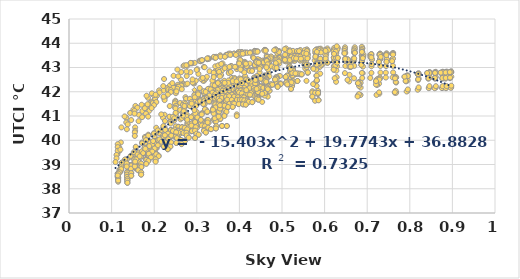
| Category | UTCI |
|---|---|
| 0.571264 | 41.801 |
| 0.678207 | 42.354 |
| 0.720713 | 42.436 |
| 0.765281 | 42.552 |
| 0.787693 | 42.621 |
| 0.819697 | 42.715 |
| 0.84077 | 42.77 |
| 0.859225 | 42.775 |
| 0.872616 | 42.787 |
| 0.884103 | 42.786 |
| 0.893847 | 42.8 |
| 0.342069 | 40.906 |
| 0.453655 | 41.915 |
| 0.521057 | 42.115 |
| 0.581872 | 42.474 |
| 0.621487 | 42.911 |
| 0.661517 | 43.022 |
| 0.686322 | 43.104 |
| 0.710557 | 43.135 |
| 0.72743 | 43.232 |
| 0.745379 | 43.233 |
| 0.758452 | 43.259 |
| 0.25131 | 40.328 |
| 0.339586 | 41.163 |
| 0.416046 | 41.752 |
| 0.469478 | 42.249 |
| 0.520092 | 42.954 |
| 0.557076 | 43.087 |
| 0.589356 | 43.181 |
| 0.622196 | 43.562 |
| 0.646584 | 43.586 |
| 0.671 | 43.605 |
| 0.687525 | 43.638 |
| 0.217103 | 39.941 |
| 0.296 | 40.753 |
| 0.356713 | 41.462 |
| 0.417143 | 41.677 |
| 0.455724 | 42.173 |
| 0.496497 | 42.326 |
| 0.531517 | 42.743 |
| 0.557729 | 43.111 |
| 0.585232 | 43.162 |
| 0.606966 | 43.194 |
| 0.630881 | 43.397 |
| 0.178851 | 39.65 |
| 0.250621 | 40.148 |
| 0.309287 | 40.839 |
| 0.354483 | 41.442 |
| 0.403418 | 41.636 |
| 0.444469 | 41.829 |
| 0.477069 | 42.291 |
| 0.510366 | 42.379 |
| 0.536267 | 42.444 |
| 0.560655 | 42.779 |
| 0.581065 | 43.118 |
| 0.169839 | 38.899 |
| 0.225379 | 39.919 |
| 0.275379 | 40.321 |
| 0.3187 | 40.58 |
| 0.365502 | 41.447 |
| 0.401159 | 41.664 |
| 0.44023 | 41.808 |
| 0.467119 | 42.223 |
| 0.496791 | 42.318 |
| 0.522172 | 42.383 |
| 0.546054 | 42.71 |
| 0.162299 | 38.765 |
| 0.204828 | 39.451 |
| 0.252851 | 40.1 |
| 0.295764 | 40.396 |
| 0.337701 | 41.278 |
| 0.376607 | 41.495 |
| 0.405977 | 41.667 |
| 0.439958 | 41.762 |
| 0.464607 | 42.188 |
| 0.489862 | 42.239 |
| 0.512368 | 42.303 |
| 0.145931 | 38.645 |
| 0.192414 | 39.325 |
| 0.239333 | 39.914 |
| 0.276296 | 40.198 |
| 0.319157 | 40.457 |
| 0.351283 | 41.036 |
| 0.385172 | 41.522 |
| 0.411438 | 41.642 |
| 0.442759 | 41.741 |
| 0.464897 | 41.837 |
| 0.489533 | 42.202 |
| 0.145931 | 38.536 |
| 0.186207 | 39.177 |
| 0.22269 | 39.746 |
| 0.26266 | 40.015 |
| 0.298927 | 40.269 |
| 0.326952 | 40.516 |
| 0.36469 | 41.062 |
| 0.387798 | 41.508 |
| 0.41851 | 41.613 |
| 0.440931 | 41.707 |
| 0.466575 | 41.798 |
| 0.13692 | 38.405 |
| 0.181379 | 39.055 |
| 0.210184 | 39.37 |
| 0.251862 | 39.889 |
| 0.280843 | 40.124 |
| 0.316745 | 40.391 |
| 0.345724 | 40.571 |
| 0.373369 | 41.369 |
| 0.398152 | 41.492 |
| 0.421862 | 41.584 |
| 0.444659 | 41.675 |
| 0.13692 | 38.334 |
| 0.169379 | 38.674 |
| 0.203103 | 39.249 |
| 0.237833 | 39.739 |
| 0.272383 | 39.994 |
| 0.304276 | 40.232 |
| 0.333103 | 40.455 |
| 0.359194 | 40.588 |
| 0.384138 | 41.375 |
| 0.408724 | 41.482 |
| 0.430038 | 41.572 |
| 0.13692 | 38.247 |
| 0.169379 | 38.587 |
| 0.203103 | 39.146 |
| 0.231842 | 39.629 |
| 0.264169 | 39.843 |
| 0.29589 | 40.092 |
| 0.321103 | 40.321 |
| 0.344806 | 40.488 |
| 0.37051 | 40.587 |
| 0.393897 | 41.068 |
| 0.41482 | 41.473 |
| 0.584708 | 41.948 |
| 0.680828 | 42.397 |
| 0.728218 | 42.508 |
| 0.766844 | 42.576 |
| 0.795344 | 42.635 |
| 0.820484 | 42.716 |
| 0.846097 | 42.768 |
| 0.861181 | 42.78 |
| 0.877339 | 42.79 |
| 0.886333 | 42.791 |
| 0.897443 | 42.802 |
| 0.352991 | 41.188 |
| 0.452621 | 41.885 |
| 0.524394 | 42.396 |
| 0.580738 | 42.662 |
| 0.629298 | 43.052 |
| 0.657814 | 43.035 |
| 0.69023 | 43.461 |
| 0.709687 | 43.497 |
| 0.730869 | 43.513 |
| 0.744648 | 43.521 |
| 0.760794 | 43.545 |
| 0.250246 | 40.34 |
| 0.33765 | 41.174 |
| 0.411896 | 42.086 |
| 0.467357 | 42.274 |
| 0.520706 | 42.68 |
| 0.554644 | 43.098 |
| 0.59035 | 43.359 |
| 0.62156 | 43.41 |
| 0.64779 | 43.597 |
| 0.668992 | 43.621 |
| 0.68849 | 43.643 |
| 0.19939 | 39.96 |
| 0.276882 | 40.841 |
| 0.341392 | 41.474 |
| 0.40431 | 42.02 |
| 0.45058 | 42.2 |
| 0.487457 | 42.35 |
| 0.524736 | 42.751 |
| 0.552955 | 43.114 |
| 0.580758 | 43.17 |
| 0.601886 | 43.367 |
| 0.62662 | 43.401 |
| 0.178513 | 39.649 |
| 0.240113 | 40.188 |
| 0.297167 | 40.866 |
| 0.351865 | 41.471 |
| 0.403219 | 41.679 |
| 0.441509 | 42.147 |
| 0.473692 | 42.301 |
| 0.510854 | 42.398 |
| 0.534852 | 42.733 |
| 0.559096 | 43.085 |
| 0.579518 | 43.136 |
| 0.153448 | 39.145 |
| 0.225862 | 39.947 |
| 0.262342 | 40.329 |
| 0.320097 | 41.274 |
| 0.362151 | 41.482 |
| 0.40046 | 41.686 |
| 0.433956 | 41.832 |
| 0.463788 | 42.239 |
| 0.493278 | 42.327 |
| 0.517514 | 42.399 |
| 0.541627 | 42.72 |
| 0.136524 | 39.038 |
| 0.186875 | 39.991 |
| 0.241851 | 40.379 |
| 0.289112 | 40.681 |
| 0.330575 | 41.594 |
| 0.369066 | 41.78 |
| 0.399578 | 41.959 |
| 0.434928 | 42.36 |
| 0.460379 | 42.46 |
| 0.4845 | 42.519 |
| 0.508006 | 42.605 |
| 0.136524 | 38.906 |
| 0.181537 | 39.582 |
| 0.222023 | 40.195 |
| 0.272585 | 40.5 |
| 0.312175 | 41.117 |
| 0.34398 | 41.335 |
| 0.376261 | 41.808 |
| 0.405178 | 41.928 |
| 0.437047 | 42.032 |
| 0.457715 | 42.427 |
| 0.483533 | 42.495 |
| 0.122414 | 38.804 |
| 0.173118 | 39.436 |
| 0.205743 | 39.756 |
| 0.25843 | 40.31 |
| 0.288644 | 40.595 |
| 0.324555 | 41.162 |
| 0.358931 | 41.361 |
| 0.387034 | 41.791 |
| 0.413133 | 41.89 |
| 0.438204 | 41.994 |
| 0.461561 | 42.091 |
| 0.11863 | 38.681 |
| 0.164884 | 39.056 |
| 0.198884 | 39.596 |
| 0.241017 | 40.187 |
| 0.279433 | 40.439 |
| 0.307713 | 40.664 |
| 0.342919 | 41.221 |
| 0.369889 | 41.661 |
| 0.394356 | 41.773 |
| 0.419702 | 41.877 |
| 0.442763 | 41.974 |
| 0.115096 | 38.605 |
| 0.156897 | 38.942 |
| 0.190258 | 39.472 |
| 0.23402 | 40.037 |
| 0.26993 | 40.297 |
| 0.300661 | 40.518 |
| 0.32798 | 40.727 |
| 0.354822 | 40.874 |
| 0.379165 | 41.66 |
| 0.406087 | 41.768 |
| 0.426007 | 41.874 |
| 0.114033 | 38.505 |
| 0.15528 | 38.845 |
| 0.18514 | 39.38 |
| 0.224289 | 39.916 |
| 0.255586 | 40.168 |
| 0.286615 | 40.366 |
| 0.31606 | 40.599 |
| 0.343236 | 40.763 |
| 0.36643 | 41.234 |
| 0.390764 | 41.659 |
| 0.410089 | 41.762 |
| 0.577969 | 41.962 |
| 0.684588 | 42.174 |
| 0.724429 | 42.522 |
| 0.768051 | 42.381 |
| 0.792728 | 42.655 |
| 0.818663 | 42.726 |
| 0.845855 | 42.787 |
| 0.858292 | 42.792 |
| 0.878673 | 42.803 |
| 0.88494 | 42.805 |
| 0.894636 | 42.815 |
| 0.34892 | 41.531 |
| 0.459676 | 41.976 |
| 0.525304 | 42.713 |
| 0.573459 | 42.971 |
| 0.627352 | 43.244 |
| 0.654075 | 43.341 |
| 0.687297 | 43.494 |
| 0.707162 | 43.517 |
| 0.728405 | 43.533 |
| 0.744036 | 43.545 |
| 0.758815 | 43.569 |
| 0.248644 | 40.141 |
| 0.349191 | 41.595 |
| 0.417071 | 41.862 |
| 0.470474 | 42.054 |
| 0.520729 | 42.767 |
| 0.557889 | 42.871 |
| 0.595675 | 43.137 |
| 0.623682 | 43.338 |
| 0.648306 | 43.366 |
| 0.668332 | 43.383 |
| 0.687488 | 43.482 |
| 0.198989 | 40.286 |
| 0.269177 | 41.111 |
| 0.346042 | 41.81 |
| 0.40532 | 42.347 |
| 0.449887 | 42.537 |
| 0.48651 | 42.97 |
| 0.524518 | 43.374 |
| 0.550387 | 43.588 |
| 0.581454 | 43.648 |
| 0.602322 | 43.69 |
| 0.628408 | 43.714 |
| 0.156838 | 39.702 |
| 0.246759 | 40.81 |
| 0.295969 | 41.56 |
| 0.351402 | 41.809 |
| 0.394745 | 42.312 |
| 0.4384 | 42.487 |
| 0.467967 | 42.631 |
| 0.505995 | 43.302 |
| 0.53421 | 43.363 |
| 0.555348 | 43.401 |
| 0.57792 | 43.613 |
| 0.152053 | 39.431 |
| 0.212315 | 40.292 |
| 0.26746 | 40.956 |
| 0.317342 | 41.61 |
| 0.359856 | 41.827 |
| 0.395531 | 42.321 |
| 0.438782 | 42.483 |
| 0.460668 | 42.572 |
| 0.49241 | 42.646 |
| 0.516151 | 43.023 |
| 0.54388 | 43.355 |
| 0.143816 | 39.301 |
| 0.194621 | 39.8 |
| 0.248033 | 40.433 |
| 0.29438 | 40.777 |
| 0.331787 | 41.662 |
| 0.372248 | 42.171 |
| 0.399298 | 42.032 |
| 0.436562 | 42.435 |
| 0.460809 | 42.532 |
| 0.485486 | 42.595 |
| 0.511245 | 42.659 |
| 0.130759 | 39.176 |
| 0.182829 | 39.903 |
| 0.235163 | 39.999 |
| 0.276043 | 40.573 |
| 0.314943 | 41.495 |
| 0.349793 | 41.713 |
| 0.378323 | 41.898 |
| 0.408424 | 42.301 |
| 0.438869 | 42.41 |
| 0.460591 | 42.505 |
| 0.487175 | 42.565 |
| 0.123997 | 39.07 |
| 0.171429 | 39.46 |
| 0.21695 | 39.838 |
| 0.256057 | 40.377 |
| 0.294013 | 40.978 |
| 0.321324 | 41.253 |
| 0.354542 | 41.745 |
| 0.381093 | 41.876 |
| 0.412474 | 42.277 |
| 0.434553 | 42.374 |
| 0.462261 | 42.482 |
| 0.115365 | 38.455 |
| 0.161084 | 39.347 |
| 0.205877 | 39.673 |
| 0.245763 | 40.279 |
| 0.279342 | 40.519 |
| 0.3104 | 41.066 |
| 0.33887 | 41.319 |
| 0.367554 | 41.749 |
| 0.395834 | 41.855 |
| 0.419792 | 41.949 |
| 0.441686 | 42.358 |
| 0.115177 | 38.386 |
| 0.153793 | 38.987 |
| 0.192818 | 39.534 |
| 0.234181 | 40.136 |
| 0.264149 | 40.368 |
| 0.297655 | 40.6 |
| 0.324043 | 40.836 |
| 0.352361 | 41.62 |
| 0.382465 | 41.757 |
| 0.403379 | 41.852 |
| 0.42681 | 42.255 |
| 0.115365 | 38.29 |
| 0.154609 | 38.889 |
| 0.192812 | 39.42 |
| 0.222227 | 39.737 |
| 0.259342 | 40.263 |
| 0.290152 | 40.46 |
| 0.311272 | 40.703 |
| 0.339544 | 40.858 |
| 0.369077 | 41.622 |
| 0.388195 | 41.753 |
| 0.412972 | 41.861 |
| 0.584777 | 42.032 |
| 0.680891 | 42.239 |
| 0.727836 | 42.333 |
| 0.766995 | 42.405 |
| 0.794881 | 42.465 |
| 0.820828 | 42.544 |
| 0.847406 | 42.596 |
| 0.860932 | 42.607 |
| 0.877241 | 42.611 |
| 0.886548 | 42.611 |
| 0.897435 | 42.623 |
| 0.351964 | 41.637 |
| 0.452622 | 42.156 |
| 0.525937 | 42.93 |
| 0.581055 | 42.973 |
| 0.628809 | 43.355 |
| 0.659062 | 43.174 |
| 0.691168 | 43.53 |
| 0.709687 | 43.555 |
| 0.730189 | 43.573 |
| 0.745735 | 43.58 |
| 0.760982 | 43.598 |
| 0.255068 | 41.201 |
| 0.336594 | 41.951 |
| 0.415992 | 42.531 |
| 0.467857 | 43.14 |
| 0.518607 | 43.265 |
| 0.556469 | 43.456 |
| 0.592297 | 43.698 |
| 0.62156 | 43.736 |
| 0.647003 | 43.758 |
| 0.669965 | 43.775 |
| 0.68867 | 43.793 |
| 0.201045 | 40.169 |
| 0.276293 | 41.068 |
| 0.344278 | 41.973 |
| 0.404884 | 42.201 |
| 0.447443 | 42.801 |
| 0.489598 | 43.25 |
| 0.525292 | 43.36 |
| 0.552955 | 43.415 |
| 0.579475 | 43.454 |
| 0.603682 | 43.548 |
| 0.627013 | 43.73 |
| 0.178879 | 39.892 |
| 0.23944 | 40.79 |
| 0.303548 | 41.749 |
| 0.350328 | 41.984 |
| 0.40055 | 42.186 |
| 0.44398 | 42.627 |
| 0.471614 | 43.043 |
| 0.510854 | 43.306 |
| 0.533647 | 43.345 |
| 0.560592 | 43.388 |
| 0.579859 | 43.424 |
| 0.153876 | 39.363 |
| 0.224455 | 40.528 |
| 0.261727 | 40.863 |
| 0.318411 | 41.811 |
| 0.356322 | 42.003 |
| 0.403218 | 42.219 |
| 0.439778 | 42.338 |
| 0.463788 | 42.998 |
| 0.492341 | 43.24 |
| 0.519231 | 43.308 |
| 0.542227 | 43.333 |
| 0.134818 | 39.19 |
| 0.186063 | 40.229 |
| 0.243531 | 40.913 |
| 0.287336 | 41.586 |
| 0.328656 | 42.127 |
| 0.371968 | 42.325 |
| 0.403199 | 42.49 |
| 0.434928 | 42.569 |
| 0.45957 | 42.649 |
| 0.486372 | 43.143 |
| 0.50881 | 43.508 |
| 0.134818 | 39.032 |
| 0.181537 | 40.065 |
| 0.225787 | 40.424 |
| 0.270751 | 41.412 |
| 0.308079 | 41.659 |
| 0.347098 | 41.874 |
| 0.37973 | 42.346 |
| 0.405178 | 42.457 |
| 0.435555 | 42.547 |
| 0.45974 | 42.625 |
| 0.483913 | 42.958 |
| 0.122866 | 38.918 |
| 0.171569 | 39.907 |
| 0.208846 | 40 |
| 0.256507 | 40.56 |
| 0.290614 | 41.504 |
| 0.327787 | 41.73 |
| 0.356511 | 42.216 |
| 0.387034 | 42.345 |
| 0.411658 | 42.435 |
| 0.440288 | 42.528 |
| 0.460766 | 42.607 |
| 0.1191 | 38.795 |
| 0.163336 | 39.487 |
| 0.199902 | 39.856 |
| 0.238998 | 40.426 |
| 0.278053 | 40.708 |
| 0.312011 | 41.606 |
| 0.339263 | 41.782 |
| 0.369889 | 42.223 |
| 0.392734 | 42.328 |
| 0.422719 | 42.424 |
| 0.441962 | 42.514 |
| 0.121212 | 38.722 |
| 0.15528 | 39.35 |
| 0.194864 | 39.722 |
| 0.231958 | 40.289 |
| 0.265401 | 40.548 |
| 0.299648 | 41.168 |
| 0.327494 | 41.666 |
| 0.354822 | 42.11 |
| 0.376863 | 42.228 |
| 0.407435 | 42.331 |
| 0.426398 | 42.419 |
| 0.114502 | 38.63 |
| 0.15528 | 39.233 |
| 0.186305 | 39.361 |
| 0.220208 | 40.18 |
| 0.257021 | 40.409 |
| 0.291178 | 41.017 |
| 0.313602 | 41.543 |
| 0.343236 | 41.704 |
| 0.364352 | 42.108 |
| 0.393085 | 42.226 |
| 0.410813 | 42.325 |
| 0.571288 | 42.021 |
| 0.678395 | 41.854 |
| 0.723167 | 42.279 |
| 0.764874 | 41.96 |
| 0.791358 | 42.429 |
| 0.819569 | 42.481 |
| 0.843544 | 42.537 |
| 0.859195 | 42.539 |
| 0.876526 | 42.54 |
| 0.884034 | 42.541 |
| 0.894307 | 42.558 |
| 0.342146 | 42.246 |
| 0.454046 | 42.128 |
| 0.522164 | 42.243 |
| 0.58106 | 43.008 |
| 0.626093 | 43.16 |
| 0.661264 | 43.231 |
| 0.687579 | 43.306 |
| 0.710908 | 43.325 |
| 0.730556 | 43.341 |
| 0.745241 | 43.337 |
| 0.759829 | 43.357 |
| 0.250856 | 41.037 |
| 0.338793 | 42.44 |
| 0.412955 | 43.132 |
| 0.468382 | 43.302 |
| 0.519562 | 43.411 |
| 0.556609 | 43.541 |
| 0.5908 | 43.776 |
| 0.622671 | 43.81 |
| 0.647963 | 43.834 |
| 0.670744 | 43.835 |
| 0.687492 | 43.855 |
| 0.216608 | 40.417 |
| 0.295115 | 41.894 |
| 0.349128 | 42.3 |
| 0.416502 | 43.118 |
| 0.455172 | 43.288 |
| 0.49592 | 43.435 |
| 0.531109 | 43.548 |
| 0.558339 | 43.747 |
| 0.58694 | 43.772 |
| 0.606627 | 43.786 |
| 0.63096 | 43.808 |
| 0.178231 | 40.137 |
| 0.249784 | 41.63 |
| 0.302772 | 41.946 |
| 0.353051 | 42.315 |
| 0.402255 | 43.13 |
| 0.443851 | 43.31 |
| 0.475169 | 43.438 |
| 0.511092 | 43.506 |
| 0.537208 | 43.537 |
| 0.560291 | 43.563 |
| 0.581257 | 43.753 |
| 0.169828 | 39.323 |
| 0.224425 | 41.051 |
| 0.273345 | 41.777 |
| 0.317221 | 42.005 |
| 0.364341 | 42.357 |
| 0.400546 | 43.212 |
| 0.439693 | 43.318 |
| 0.467894 | 43.402 |
| 0.491967 | 43.463 |
| 0.521857 | 43.501 |
| 0.544555 | 43.519 |
| 0.162261 | 39.143 |
| 0.203879 | 40.299 |
| 0.249383 | 41.591 |
| 0.29426 | 41.86 |
| 0.338582 | 42.116 |
| 0.375948 | 42.807 |
| 0.404755 | 43.251 |
| 0.440805 | 43.296 |
| 0.463999 | 43.373 |
| 0.489529 | 43.404 |
| 0.5131 | 43.45 |
| 0.145881 | 38.979 |
| 0.191451 | 39.822 |
| 0.236511 | 41.41 |
| 0.274756 | 41.71 |
| 0.316686 | 41.948 |
| 0.350575 | 42.399 |
| 0.382567 | 42.57 |
| 0.412375 | 43.231 |
| 0.438122 | 43.286 |
| 0.464529 | 43.342 |
| 0.487906 | 43.378 |
| 0.145881 | 38.855 |
| 0.185201 | 39.364 |
| 0.220609 | 40.929 |
| 0.261044 | 41.538 |
| 0.302263 | 41.84 |
| 0.326121 | 42.114 |
| 0.364356 | 42.453 |
| 0.388751 | 42.567 |
| 0.414235 | 43.206 |
| 0.440535 | 43.263 |
| 0.461799 | 43.319 |
| 0.136877 | 38.704 |
| 0.180388 | 39.212 |
| 0.20896 | 39.894 |
| 0.250186 | 41.426 |
| 0.284028 | 41.711 |
| 0.31592 | 42.02 |
| 0.345366 | 42.2 |
| 0.374612 | 42.467 |
| 0.400215 | 42.55 |
| 0.421462 | 42.896 |
| 0.444591 | 43.247 |
| 0.136877 | 38.613 |
| 0.168319 | 39.059 |
| 0.201057 | 39.451 |
| 0.236111 | 40.962 |
| 0.270436 | 41.551 |
| 0.303448 | 41.895 |
| 0.332759 | 42.104 |
| 0.360212 | 42.377 |
| 0.38691 | 42.477 |
| 0.408351 | 42.551 |
| 0.428582 | 42.901 |
| 0.136877 | 38.501 |
| 0.168319 | 38.943 |
| 0.199648 | 39.346 |
| 0.231117 | 40.203 |
| 0.267028 | 41.454 |
| 0.295086 | 41.771 |
| 0.320714 | 41.994 |
| 0.346159 | 42.298 |
| 0.374094 | 42.366 |
| 0.393517 | 42.46 |
| 0.41607 | 42.546 |
| 0.585645 | 41.661 |
| 0.680718 | 41.851 |
| 0.728405 | 41.919 |
| 0.767152 | 41.981 |
| 0.794796 | 42.038 |
| 0.820484 | 42.123 |
| 0.845881 | 42.17 |
| 0.86085 | 42.17 |
| 0.877044 | 42.17 |
| 0.886117 | 42.173 |
| 0.897087 | 42.185 |
| 0.351912 | 41.864 |
| 0.452252 | 42.043 |
| 0.525958 | 42.437 |
| 0.581386 | 42.237 |
| 0.628368 | 42.602 |
| 0.657814 | 42.426 |
| 0.68938 | 42.763 |
| 0.709848 | 42.778 |
| 0.731128 | 42.791 |
| 0.743678 | 42.786 |
| 0.760895 | 42.797 |
| 0.250862 | 41.941 |
| 0.337141 | 42.294 |
| 0.413526 | 42.639 |
| 0.468379 | 42.763 |
| 0.518692 | 42.863 |
| 0.554644 | 42.962 |
| 0.589068 | 43.027 |
| 0.621751 | 43.058 |
| 0.648726 | 43.065 |
| 0.669531 | 43.068 |
| 0.688411 | 43.076 |
| 0.200048 | 41.635 |
| 0.276276 | 42.647 |
| 0.34442 | 42.868 |
| 0.40376 | 43.021 |
| 0.448003 | 43.156 |
| 0.487457 | 43.435 |
| 0.523659 | 43.519 |
| 0.553169 | 43.554 |
| 0.581281 | 43.565 |
| 0.600216 | 43.571 |
| 0.627421 | 43.592 |
| 0.179167 | 41.404 |
| 0.239448 | 42.189 |
| 0.303736 | 42.736 |
| 0.348727 | 42.906 |
| 0.399642 | 43.05 |
| 0.441509 | 43.184 |
| 0.472438 | 43.29 |
| 0.511146 | 43.506 |
| 0.535773 | 43.514 |
| 0.559914 | 43.533 |
| 0.580365 | 43.55 |
| 0.152897 | 41.13 |
| 0.225144 | 41.757 |
| 0.263561 | 42.812 |
| 0.316654 | 43.021 |
| 0.360362 | 43.17 |
| 0.40046 | 43.336 |
| 0.431873 | 43.427 |
| 0.464168 | 43.484 |
| 0.492947 | 43.679 |
| 0.518508 | 43.711 |
| 0.542776 | 43.721 |
| 0.134459 | 40.931 |
| 0.185327 | 41.751 |
| 0.245488 | 42.658 |
| 0.285484 | 43.175 |
| 0.328849 | 43.364 |
| 0.369066 | 43.52 |
| 0.398036 | 43.639 |
| 0.435386 | 43.688 |
| 0.459908 | 43.728 |
| 0.48556 | 43.745 |
| 0.509406 | 43.789 |
| 0.134459 | 40.735 |
| 0.181537 | 41.346 |
| 0.223191 | 42.524 |
| 0.26884 | 43.068 |
| 0.308843 | 43.257 |
| 0.34398 | 43.434 |
| 0.374665 | 43.569 |
| 0.4057 | 43.639 |
| 0.436901 | 43.676 |
| 0.458845 | 43.72 |
| 0.484588 | 43.743 |
| 0.121792 | 39.908 |
| 0.172342 | 41.205 |
| 0.206557 | 41.836 |
| 0.254502 | 42.915 |
| 0.288921 | 43.172 |
| 0.324555 | 43.343 |
| 0.355544 | 43.489 |
| 0.387561 | 43.576 |
| 0.412432 | 43.62 |
| 0.439395 | 43.669 |
| 0.461945 | 43.715 |
| 0.117992 | 39.702 |
| 0.16408 | 41.049 |
| 0.20203 | 41.703 |
| 0.236893 | 42.262 |
| 0.277689 | 43.072 |
| 0.306324 | 43.279 |
| 0.340589 | 43.425 |
| 0.369054 | 43.519 |
| 0.395853 | 43.571 |
| 0.417026 | 43.621 |
| 0.442757 | 43.669 |
| 0.117804 | 39.558 |
| 0.15528 | 40.532 |
| 0.193966 | 41.588 |
| 0.229808 | 42.149 |
| 0.265347 | 42.38 |
| 0.295026 | 43.19 |
| 0.325036 | 43.362 |
| 0.355438 | 43.454 |
| 0.379498 | 43.535 |
| 0.401527 | 43.578 |
| 0.425782 | 43.628 |
| 0.113394 | 39.41 |
| 0.15528 | 40.388 |
| 0.188481 | 41.216 |
| 0.222188 | 42.051 |
| 0.25548 | 42.287 |
| 0.285165 | 42.809 |
| 0.312931 | 43.288 |
| 0.342396 | 43.403 |
| 0.366681 | 43.449 |
| 0.39208 | 43.535 |
| 0.411634 | 43.585 |
| 0.577563 | 41.628 |
| 0.684414 | 41.867 |
| 0.721931 | 41.869 |
| 0.767882 | 41.959 |
| 0.792613 | 42.01 |
| 0.818538 | 42.083 |
| 0.84446 | 42.15 |
| 0.858292 | 42.146 |
| 0.875568 | 42.151 |
| 0.884862 | 42.147 |
| 0.896307 | 42.163 |
| 0.348782 | 41.783 |
| 0.45931 | 41.841 |
| 0.52377 | 42.234 |
| 0.573123 | 42.317 |
| 0.626912 | 42.41 |
| 0.653738 | 42.489 |
| 0.688368 | 42.568 |
| 0.707162 | 42.569 |
| 0.729618 | 42.594 |
| 0.743724 | 42.587 |
| 0.759693 | 42.592 |
| 0.248414 | 41.525 |
| 0.34869 | 41.684 |
| 0.414897 | 42.288 |
| 0.47003 | 42.215 |
| 0.520184 | 42.599 |
| 0.557407 | 42.449 |
| 0.589609 | 42.746 |
| 0.623682 | 42.557 |
| 0.647669 | 42.769 |
| 0.669138 | 42.555 |
| 0.68751 | 42.778 |
| 0.198759 | 41.859 |
| 0.268552 | 42.305 |
| 0.345103 | 42.742 |
| 0.40532 | 42.899 |
| 0.449226 | 43.009 |
| 0.48651 | 43.178 |
| 0.52692 | 43.282 |
| 0.550387 | 43.29 |
| 0.580818 | 43.296 |
| 0.601793 | 43.304 |
| 0.628766 | 43.325 |
| 0.155908 | 41.417 |
| 0.246759 | 42.185 |
| 0.293356 | 42.336 |
| 0.350778 | 42.816 |
| 0.394023 | 42.933 |
| 0.4384 | 43.037 |
| 0.468782 | 43.151 |
| 0.505995 | 43.274 |
| 0.530262 | 43.276 |
| 0.556517 | 43.278 |
| 0.576766 | 43.291 |
| 0.151126 | 41.26 |
| 0.211586 | 42.057 |
| 0.266345 | 42.259 |
| 0.31665 | 42.448 |
| 0.35905 | 42.879 |
| 0.395531 | 43.016 |
| 0.43531 | 43.109 |
| 0.460668 | 43.139 |
| 0.493444 | 43.161 |
| 0.517414 | 43.197 |
| 0.542958 | 43.281 |
| 0.143586 | 41.126 |
| 0.194621 | 41.934 |
| 0.246299 | 42.148 |
| 0.293635 | 42.386 |
| 0.329946 | 42.845 |
| 0.372248 | 42.985 |
| 0.401207 | 43.09 |
| 0.436562 | 43.098 |
| 0.459467 | 43.128 |
| 0.486828 | 43.146 |
| 0.509341 | 43.25 |
| 0.130529 | 40.982 |
| 0.182069 | 41.835 |
| 0.232874 | 42.062 |
| 0.275271 | 42.306 |
| 0.314023 | 42.462 |
| 0.349793 | 42.934 |
| 0.380575 | 43.063 |
| 0.408424 | 43.084 |
| 0.43932 | 43.101 |
| 0.462 | 43.134 |
| 0.485962 | 43.224 |
| 0.122989 | 40.531 |
| 0.170621 | 41.464 |
| 0.212552 | 41.969 |
| 0.255251 | 42.21 |
| 0.290912 | 42.393 |
| 0.321324 | 42.544 |
| 0.35723 | 42.69 |
| 0.381093 | 43.046 |
| 0.413416 | 43.073 |
| 0.436069 | 43.106 |
| 0.462092 | 43.221 |
| 0.114345 | 39.839 |
| 0.160276 | 41.34 |
| 0.203264 | 41.875 |
| 0.244926 | 42.169 |
| 0.278222 | 42.335 |
| 0.3104 | 42.522 |
| 0.340046 | 42.652 |
| 0.367554 | 43.021 |
| 0.393747 | 43.035 |
| 0.418897 | 43.078 |
| 0.441517 | 43.19 |
| 0.114345 | 39.718 |
| 0.153793 | 41.21 |
| 0.190207 | 41.527 |
| 0.23334 | 42.094 |
| 0.263142 | 42.256 |
| 0.297655 | 42.453 |
| 0.32369 | 42.618 |
| 0.352361 | 42.82 |
| 0.376552 | 43.027 |
| 0.403379 | 43.054 |
| 0.424245 | 43.164 |
| 0.114345 | 39.565 |
| 0.153793 | 41.1 |
| 0.190207 | 41.469 |
| 0.222227 | 41.756 |
| 0.257441 | 42.207 |
| 0.290152 | 42.382 |
| 0.313805 | 42.571 |
| 0.339544 | 42.784 |
| 0.365453 | 42.973 |
| 0.389793 | 43.029 |
| 0.411073 | 43.139 |
| 0.585805 | 41.646 |
| 0.680603 | 41.902 |
| 0.728003 | 41.975 |
| 0.766844 | 42.038 |
| 0.795315 | 42.096 |
| 0.820718 | 42.18 |
| 0.846077 | 42.231 |
| 0.861181 | 42.23 |
| 0.876929 | 42.23 |
| 0.88626 | 42.235 |
| 0.897406 | 42.249 |
| 0.349195 | 42.079 |
| 0.451868 | 42.24 |
| 0.525374 | 42.636 |
| 0.580738 | 42.44 |
| 0.627621 | 42.87 |
| 0.658621 | 42.696 |
| 0.689955 | 43.039 |
| 0.71002 | 43.051 |
| 0.730814 | 43.064 |
| 0.744326 | 43.06 |
| 0.760417 | 43.069 |
| 0.254425 | 42.124 |
| 0.336594 | 42.461 |
| 0.411436 | 42.8 |
| 0.467357 | 42.921 |
| 0.518252 | 43.022 |
| 0.555833 | 43.116 |
| 0.589955 | 43.185 |
| 0.622011 | 43.284 |
| 0.648285 | 43.29 |
| 0.669406 | 43.292 |
| 0.688011 | 43.298 |
| 0.196609 | 41.534 |
| 0.275686 | 42.836 |
| 0.343369 | 43.047 |
| 0.40431 | 43.185 |
| 0.4472 | 43.314 |
| 0.488867 | 43.595 |
| 0.525741 | 43.686 |
| 0.553521 | 43.716 |
| 0.580736 | 43.724 |
| 0.601337 | 43.729 |
| 0.625431 | 43.75 |
| 0.177931 | 41.32 |
| 0.238776 | 42.068 |
| 0.3011 | 42.931 |
| 0.350328 | 43.089 |
| 0.39969 | 43.222 |
| 0.44311 | 43.345 |
| 0.474048 | 43.454 |
| 0.511514 | 43.673 |
| 0.535182 | 43.679 |
| 0.559743 | 43.697 |
| 0.578049 | 43.71 |
| 0.146038 | 40.834 |
| 0.224455 | 41.656 |
| 0.262786 | 42.501 |
| 0.318411 | 43.011 |
| 0.357414 | 43.148 |
| 0.402252 | 43.303 |
| 0.433233 | 43.389 |
| 0.464516 | 43.437 |
| 0.492883 | 43.639 |
| 0.518202 | 43.668 |
| 0.539958 | 43.676 |
| 0.137816 | 40.655 |
| 0.184483 | 41.485 |
| 0.242566 | 42.356 |
| 0.287336 | 43.185 |
| 0.326937 | 43.374 |
| 0.370964 | 43.516 |
| 0.401653 | 43.632 |
| 0.435739 | 43.663 |
| 0.459834 | 43.702 |
| 0.485273 | 43.716 |
| 0.506186 | 43.756 |
| 0.135805 | 40.454 |
| 0.180788 | 41.099 |
| 0.221241 | 42.233 |
| 0.270751 | 43.086 |
| 0.307834 | 43.267 |
| 0.34601 | 43.442 |
| 0.378316 | 43.574 |
| 0.406074 | 43.622 |
| 0.436828 | 43.657 |
| 0.458567 | 43.695 |
| 0.481609 | 43.714 |
| 0.120629 | 39.612 |
| 0.171569 | 40.953 |
| 0.204915 | 41.575 |
| 0.256507 | 42.636 |
| 0.285541 | 43.189 |
| 0.326671 | 43.355 |
| 0.354998 | 43.5 |
| 0.387928 | 43.567 |
| 0.412359 | 43.606 |
| 0.439054 | 43.65 |
| 0.461641 | 43.693 |
| 0.111555 | 39.395 |
| 0.163336 | 40.788 |
| 0.199555 | 41.447 |
| 0.238998 | 41.988 |
| 0.275362 | 43.095 |
| 0.310852 | 43.294 |
| 0.340005 | 43.439 |
| 0.370822 | 43.516 |
| 0.395025 | 43.561 |
| 0.418825 | 43.602 |
| 0.4425 | 43.65 |
| 0.111555 | 39.253 |
| 0.154504 | 40.325 |
| 0.193845 | 41.328 |
| 0.231958 | 41.882 |
| 0.264727 | 42.107 |
| 0.299648 | 42.901 |
| 0.324413 | 43.375 |
| 0.355795 | 43.448 |
| 0.378667 | 43.521 |
| 0.404292 | 43.564 |
| 0.424777 | 43.61 |
| 0.109135 | 39.101 |
| 0.154504 | 40.178 |
| 0.185811 | 40.974 |
| 0.222188 | 41.796 |
| 0.252207 | 42.016 |
| 0.289909 | 42.509 |
| 0.312344 | 43.304 |
| 0.344254 | 43.4 |
| 0.365811 | 43.443 |
| 0.391721 | 43.519 |
| 0.407822 | 43.568 |
| 0.571194 | 41.967 |
| 0.67741 | 41.805 |
| 0.720572 | 42.3 |
| 0.764874 | 41.981 |
| 0.790096 | 42.447 |
| 0.819697 | 42.511 |
| 0.84383 | 42.561 |
| 0.859195 | 42.564 |
| 0.876422 | 42.564 |
| 0.884267 | 42.569 |
| 0.894472 | 42.584 |
| 0.342207 | 42.259 |
| 0.452428 | 42.069 |
| 0.520751 | 42.732 |
| 0.58106 | 42.945 |
| 0.625151 | 43.089 |
| 0.661517 | 43.179 |
| 0.687811 | 43.239 |
| 0.711016 | 43.335 |
| 0.729815 | 43.35 |
| 0.746121 | 43.347 |
| 0.760381 | 43.366 |
| 0.250856 | 41.421 |
| 0.339586 | 42.605 |
| 0.41491 | 43.095 |
| 0.468382 | 43.224 |
| 0.521101 | 43.325 |
| 0.557076 | 43.468 |
| 0.59131 | 43.702 |
| 0.622736 | 43.736 |
| 0.647336 | 43.76 |
| 0.670744 | 43.757 |
| 0.688255 | 43.776 |
| 0.216608 | 41.068 |
| 0.294441 | 42.078 |
| 0.354221 | 42.632 |
| 0.417143 | 43.058 |
| 0.457035 | 43.216 |
| 0.495201 | 43.369 |
| 0.529975 | 43.469 |
| 0.558426 | 43.676 |
| 0.585647 | 43.7 |
| 0.608136 | 43.714 |
| 0.629965 | 43.74 |
| 0.179034 | 40.102 |
| 0.24898 | 41.345 |
| 0.306909 | 42.153 |
| 0.353051 | 42.327 |
| 0.403104 | 43.07 |
| 0.442984 | 43.257 |
| 0.47329 | 43.376 |
| 0.5112 | 43.433 |
| 0.536072 | 43.459 |
| 0.560291 | 43.489 |
| 0.580178 | 43.514 |
| 0.169224 | 39.333 |
| 0.225379 | 40.793 |
| 0.273514 | 41.508 |
| 0.317221 | 41.724 |
| 0.365316 | 42.367 |
| 0.399521 | 43.166 |
| 0.440217 | 43.269 |
| 0.46811 | 43.339 |
| 0.493568 | 43.395 |
| 0.521857 | 43.431 |
| 0.543308 | 43.448 |
| 0.162483 | 39.128 |
| 0.204828 | 40.515 |
| 0.250229 | 41.308 |
| 0.29426 | 41.587 |
| 0.339387 | 41.954 |
| 0.374891 | 42.772 |
| 0.402534 | 42.918 |
| 0.441 | 43.244 |
| 0.463307 | 43.313 |
| 0.489529 | 43.343 |
| 0.51141 | 43.379 |
| 0.146115 | 38.958 |
| 0.1905 | 39.899 |
| 0.23798 | 40.752 |
| 0.274756 | 41.43 |
| 0.315278 | 41.672 |
| 0.349444 | 42.361 |
| 0.379789 | 42.815 |
| 0.412548 | 43.18 |
| 0.439373 | 43.234 |
| 0.464529 | 43.289 |
| 0.486285 | 43.321 |
| 0.145203 | 38.827 |
| 0.186207 | 39.364 |
| 0.221418 | 40.583 |
| 0.261044 | 41.25 |
| 0.301896 | 41.532 |
| 0.324954 | 41.777 |
| 0.363334 | 42.102 |
| 0.388989 | 42.516 |
| 0.41527 | 43.156 |
| 0.440535 | 43.215 |
| 0.464093 | 43.266 |
| 0.136195 | 38.669 |
| 0.181379 | 39.187 |
| 0.208355 | 40.407 |
| 0.250186 | 41.127 |
| 0.283911 | 41.408 |
| 0.31592 | 41.692 |
| 0.347974 | 41.859 |
| 0.374612 | 42.118 |
| 0.398061 | 42.502 |
| 0.423886 | 42.86 |
| 0.445022 | 43.198 |
| 0.136195 | 38.588 |
| 0.169379 | 39.04 |
| 0.2017 | 39.973 |
| 0.236111 | 40.972 |
| 0.270711 | 41.264 |
| 0.30221 | 41.561 |
| 0.328399 | 41.777 |
| 0.360515 | 42.037 |
| 0.384368 | 42.439 |
| 0.409208 | 42.504 |
| 0.429938 | 42.857 |
| 0.136195 | 38.493 |
| 0.167277 | 38.919 |
| 0.200396 | 39.855 |
| 0.23012 | 40.196 |
| 0.267045 | 41.135 |
| 0.295086 | 41.433 |
| 0.321794 | 41.664 |
| 0.346159 | 41.964 |
| 0.372054 | 42.028 |
| 0.393517 | 42.425 |
| 0.414231 | 42.5 |
| 0.584531 | 41.902 |
| 0.680778 | 42.394 |
| 0.729877 | 42.545 |
| 0.766502 | 42.618 |
| 0.79496 | 42.678 |
| 0.820605 | 42.767 |
| 0.846928 | 42.811 |
| 0.86111 | 42.822 |
| 0.877104 | 42.825 |
| 0.886409 | 42.831 |
| 0.896955 | 42.844 |
| 0.352262 | 41.631 |
| 0.452311 | 42.196 |
| 0.525497 | 42.899 |
| 0.579926 | 42.908 |
| 0.627722 | 43.275 |
| 0.658297 | 43.12 |
| 0.690614 | 43.45 |
| 0.709505 | 43.546 |
| 0.730162 | 43.564 |
| 0.745103 | 43.572 |
| 0.760258 | 43.587 |
| 0.250917 | 40.574 |
| 0.33661 | 41.965 |
| 0.416115 | 42.501 |
| 0.466133 | 43.131 |
| 0.51846 | 43.261 |
| 0.555341 | 43.377 |
| 0.591367 | 43.62 |
| 0.621286 | 43.66 |
| 0.646957 | 43.681 |
| 0.669406 | 43.699 |
| 0.687413 | 43.715 |
| 0.200147 | 39.951 |
| 0.275715 | 40.976 |
| 0.343267 | 41.662 |
| 0.40376 | 42.191 |
| 0.447408 | 42.942 |
| 0.486854 | 43.25 |
| 0.52685 | 43.349 |
| 0.552586 | 43.403 |
| 0.579427 | 43.438 |
| 0.602586 | 43.462 |
| 0.626054 | 43.658 |
| 0.179359 | 39.656 |
| 0.238811 | 40.69 |
| 0.298792 | 41.427 |
| 0.350513 | 41.676 |
| 0.399866 | 42.183 |
| 0.440816 | 42.647 |
| 0.475546 | 43.05 |
| 0.510466 | 43.303 |
| 0.533653 | 43.338 |
| 0.559743 | 43.379 |
| 0.578833 | 43.41 |
| 0.15373 | 39.353 |
| 0.224431 | 40.438 |
| 0.264721 | 40.916 |
| 0.318596 | 41.497 |
| 0.357919 | 41.703 |
| 0.399719 | 42.223 |
| 0.43719 | 42.342 |
| 0.463417 | 43.008 |
| 0.492299 | 43.243 |
| 0.518202 | 43.307 |
| 0.540855 | 43.332 |
| 0.135339 | 39.209 |
| 0.186094 | 40.192 |
| 0.244133 | 40.97 |
| 0.2875 | 41.578 |
| 0.329773 | 41.842 |
| 0.368276 | 42.048 |
| 0.403187 | 42.514 |
| 0.434549 | 42.591 |
| 0.459215 | 42.673 |
| 0.485273 | 43.179 |
| 0.507186 | 43.53 |
| 0.135339 | 39.058 |
| 0.180788 | 40.009 |
| 0.226155 | 40.426 |
| 0.270915 | 41.411 |
| 0.308191 | 41.651 |
| 0.343125 | 41.903 |
| 0.38004 | 42.071 |
| 0.404775 | 42.177 |
| 0.436226 | 42.567 |
| 0.458567 | 42.652 |
| 0.482665 | 42.998 |
| 0.122719 | 38.926 |
| 0.171607 | 39.876 |
| 0.209219 | 40.009 |
| 0.256671 | 40.544 |
| 0.287755 | 41.511 |
| 0.323645 | 41.737 |
| 0.358744 | 41.945 |
| 0.386638 | 42.072 |
| 0.411715 | 42.155 |
| 0.439054 | 42.556 |
| 0.460449 | 42.636 |
| 0.118953 | 38.789 |
| 0.16339 | 39.494 |
| 0.201718 | 39.846 |
| 0.239204 | 40.422 |
| 0.278512 | 40.703 |
| 0.307713 | 41.609 |
| 0.341077 | 41.795 |
| 0.369474 | 41.959 |
| 0.392871 | 42.057 |
| 0.420965 | 42.46 |
| 0.441619 | 42.543 |
| 0.118056 | 38.702 |
| 0.155424 | 39.362 |
| 0.196176 | 39.708 |
| 0.232122 | 40.273 |
| 0.265058 | 40.534 |
| 0.296439 | 41.109 |
| 0.325363 | 41.675 |
| 0.354432 | 41.836 |
| 0.377041 | 41.967 |
| 0.403748 | 42.064 |
| 0.423908 | 42.151 |
| 0.114356 | 38.622 |
| 0.154504 | 39.251 |
| 0.187647 | 39.371 |
| 0.222393 | 40.149 |
| 0.25463 | 40.406 |
| 0.286615 | 40.951 |
| 0.315477 | 41.56 |
| 0.342838 | 41.723 |
| 0.364479 | 41.833 |
| 0.391721 | 41.969 |
| 0.409102 | 42.063 |
| 0.577762 | 41.959 |
| 0.684588 | 42.368 |
| 0.722167 | 42.498 |
| 0.768051 | 42.595 |
| 0.792728 | 42.658 |
| 0.818663 | 42.73 |
| 0.845007 | 42.791 |
| 0.858388 | 42.796 |
| 0.877114 | 42.807 |
| 0.88494 | 42.809 |
| 0.895313 | 42.818 |
| 0.349331 | 41.208 |
| 0.459747 | 41.946 |
| 0.524373 | 42.674 |
| 0.57362 | 42.946 |
| 0.627367 | 43.23 |
| 0.654215 | 43.33 |
| 0.688557 | 43.411 |
| 0.707617 | 43.434 |
| 0.729493 | 43.522 |
| 0.744159 | 43.534 |
| 0.759644 | 43.556 |
| 0.249167 | 40.132 |
| 0.349191 | 41.281 |
| 0.415623 | 41.525 |
| 0.470715 | 42.039 |
| 0.520838 | 42.761 |
| 0.55803 | 43.017 |
| 0.592328 | 43.113 |
| 0.62423 | 43.325 |
| 0.648469 | 43.355 |
| 0.669581 | 43.373 |
| 0.688081 | 43.399 |
| 0.199625 | 40.278 |
| 0.269177 | 41.196 |
| 0.345977 | 41.781 |
| 0.406133 | 42.354 |
| 0.44998 | 42.537 |
| 0.487291 | 42.984 |
| 0.527634 | 43.388 |
| 0.551085 | 43.589 |
| 0.581834 | 43.643 |
| 0.602357 | 43.685 |
| 0.628605 | 43.875 |
| 0.156838 | 39.731 |
| 0.247431 | 40.902 |
| 0.29437 | 41.247 |
| 0.351724 | 41.81 |
| 0.394964 | 42.018 |
| 0.439324 | 42.492 |
| 0.470505 | 42.634 |
| 0.506826 | 43.316 |
| 0.533115 | 43.375 |
| 0.557231 | 43.57 |
| 0.578418 | 43.452 |
| 0.152053 | 39.509 |
| 0.212315 | 40.037 |
| 0.267417 | 41.015 |
| 0.317744 | 41.613 |
| 0.360059 | 41.83 |
| 0.396566 | 42.034 |
| 0.437466 | 42.487 |
| 0.461658 | 42.574 |
| 0.49503 | 42.653 |
| 0.518209 | 43.04 |
| 0.544496 | 43.366 |
| 0.144546 | 39.353 |
| 0.195355 | 39.824 |
| 0.247431 | 40.44 |
| 0.294782 | 40.779 |
| 0.331113 | 41.667 |
| 0.373371 | 41.874 |
| 0.403377 | 42.05 |
| 0.437601 | 42.137 |
| 0.463562 | 42.53 |
| 0.487685 | 42.605 |
| 0.511988 | 42.668 |
| 0.131504 | 39.209 |
| 0.182829 | 39.683 |
| 0.234014 | 40.008 |
| 0.276485 | 40.58 |
| 0.315224 | 41.496 |
| 0.350964 | 41.711 |
| 0.382126 | 41.896 |
| 0.409517 | 42.014 |
| 0.441418 | 42.115 |
| 0.462896 | 42.514 |
| 0.487696 | 42.565 |
| 0.123997 | 39.078 |
| 0.171358 | 39.547 |
| 0.213699 | 39.855 |
| 0.256499 | 40.385 |
| 0.292142 | 40.678 |
| 0.322562 | 41.185 |
| 0.35855 | 41.743 |
| 0.382277 | 41.88 |
| 0.415999 | 41.986 |
| 0.437051 | 42.089 |
| 0.46335 | 42.182 |
| 0.115365 | 38.455 |
| 0.161084 | 39.413 |
| 0.20441 | 39.704 |
| 0.246245 | 40.264 |
| 0.279475 | 40.53 |
| 0.311668 | 41.066 |
| 0.341414 | 41.322 |
| 0.368787 | 41.75 |
| 0.395858 | 41.858 |
| 0.419898 | 41.978 |
| 0.443088 | 42.07 |
| 0.115365 | 38.411 |
| 0.154609 | 39.034 |
| 0.191414 | 39.589 |
| 0.234624 | 40.123 |
| 0.264493 | 40.371 |
| 0.298973 | 40.61 |
| 0.326286 | 40.839 |
| 0.353673 | 41.631 |
| 0.381025 | 41.753 |
| 0.404451 | 41.864 |
| 0.427786 | 41.963 |
| 0.115365 | 38.34 |
| 0.154609 | 38.922 |
| 0.191414 | 39.506 |
| 0.223565 | 39.756 |
| 0.258769 | 40.248 |
| 0.291513 | 40.462 |
| 0.315294 | 40.696 |
| 0.340876 | 40.86 |
| 0.368619 | 41.62 |
| 0.390887 | 41.757 |
| 0.41373 | 41.867 |
| 0.584674 | 41.952 |
| 0.681259 | 42.327 |
| 0.728315 | 42.497 |
| 0.767152 | 42.579 |
| 0.795195 | 42.644 |
| 0.820836 | 42.718 |
| 0.846342 | 42.775 |
| 0.861273 | 42.783 |
| 0.877869 | 42.796 |
| 0.886409 | 42.799 |
| 0.897038 | 42.81 |
| 0.352251 | 41.177 |
| 0.453486 | 41.581 |
| 0.525448 | 42.363 |
| 0.581386 | 42.66 |
| 0.629486 | 43.201 |
| 0.659046 | 43.039 |
| 0.689801 | 43.384 |
| 0.709848 | 43.414 |
| 0.731753 | 43.437 |
| 0.744983 | 43.51 |
| 0.760631 | 43.531 |
| 0.251097 | 40.35 |
| 0.338306 | 41.172 |
| 0.414535 | 41.779 |
| 0.468379 | 42.275 |
| 0.520338 | 42.991 |
| 0.55639 | 43.108 |
| 0.589917 | 43.361 |
| 0.621751 | 43.404 |
| 0.648473 | 43.604 |
| 0.670418 | 43.629 |
| 0.687908 | 43.654 |
| 0.197388 | 39.966 |
| 0.277624 | 40.844 |
| 0.343592 | 41.478 |
| 0.404884 | 41.724 |
| 0.449553 | 42.212 |
| 0.487457 | 42.356 |
| 0.524053 | 42.777 |
| 0.553169 | 43.122 |
| 0.582232 | 43.18 |
| 0.602458 | 43.368 |
| 0.626639 | 43.405 |
| 0.17722 | 39.684 |
| 0.24093 | 40.198 |
| 0.301372 | 40.939 |
| 0.35099 | 41.475 |
| 0.403017 | 41.691 |
| 0.441509 | 41.858 |
| 0.472578 | 42.308 |
| 0.511146 | 42.403 |
| 0.5362 | 42.762 |
| 0.561301 | 43.103 |
| 0.579788 | 43.149 |
| 0.153736 | 39.208 |
| 0.226649 | 39.708 |
| 0.26406 | 40.346 |
| 0.319149 | 41.281 |
| 0.358988 | 41.489 |
| 0.40046 | 41.705 |
| 0.433802 | 42.15 |
| 0.464168 | 42.247 |
| 0.495627 | 42.335 |
| 0.519987 | 42.414 |
| 0.542051 | 42.748 |
| 0.135345 | 39.043 |
| 0.188555 | 39.758 |
| 0.243735 | 40.382 |
| 0.288146 | 40.689 |
| 0.328736 | 41.601 |
| 0.369066 | 41.796 |
| 0.399307 | 41.969 |
| 0.435386 | 42.065 |
| 0.46323 | 42.476 |
| 0.487219 | 42.535 |
| 0.508516 | 42.612 |
| 0.135345 | 38.915 |
| 0.181537 | 39.614 |
| 0.225015 | 40.205 |
| 0.271586 | 40.511 |
| 0.311063 | 40.765 |
| 0.34398 | 41.353 |
| 0.375892 | 41.816 |
| 0.4057 | 41.933 |
| 0.439461 | 42.044 |
| 0.460673 | 42.447 |
| 0.483797 | 42.505 |
| 0.122701 | 38.812 |
| 0.174063 | 39.471 |
| 0.208404 | 39.792 |
| 0.257373 | 40.31 |
| 0.287454 | 40.606 |
| 0.324555 | 41.182 |
| 0.354704 | 41.305 |
| 0.387561 | 41.8 |
| 0.416036 | 41.896 |
| 0.44122 | 42.014 |
| 0.462759 | 42.412 |
| 0.118918 | 38.676 |
| 0.165817 | 39.337 |
| 0.200947 | 39.66 |
| 0.239912 | 40.192 |
| 0.277346 | 40.451 |
| 0.309596 | 40.682 |
| 0.339074 | 41.166 |
| 0.371445 | 41.676 |
| 0.39635 | 41.776 |
| 0.420616 | 41.891 |
| 0.443653 | 41.987 |
| 0.116092 | 38.623 |
| 0.157887 | 39.213 |
| 0.195216 | 39.535 |
| 0.23289 | 40.042 |
| 0.26863 | 40.303 |
| 0.297385 | 40.539 |
| 0.325431 | 40.735 |
| 0.355438 | 40.886 |
| 0.382026 | 41.668 |
| 0.406634 | 41.777 |
| 0.424867 | 41.88 |
| 0.114368 | 38.549 |
| 0.15528 | 39.121 |
| 0.1873 | 39.444 |
| 0.223121 | 39.938 |
| 0.254243 | 40.175 |
| 0.288599 | 40.378 |
| 0.311987 | 40.609 |
| 0.344989 | 40.774 |
| 0.369639 | 41.172 |
| 0.394134 | 41.669 |
| 0.410637 | 41.768 |
| 0.57131 | 41.801 |
| 0.678207 | 42.354 |
| 0.720736 | 42.436 |
| 0.765281 | 42.552 |
| 0.787693 | 42.621 |
| 0.819697 | 42.728 |
| 0.840782 | 42.77 |
| 0.859225 | 42.775 |
| 0.872625 | 42.787 |
| 0.884103 | 42.795 |
| 0.893854 | 42.808 |
| 0.342253 | 40.906 |
| 0.453655 | 41.915 |
| 0.521149 | 42.115 |
| 0.581872 | 42.474 |
| 0.621487 | 42.911 |
| 0.661517 | 43.038 |
| 0.686368 | 43.108 |
| 0.710557 | 43.135 |
| 0.727467 | 43.232 |
| 0.745379 | 43.234 |
| 0.758483 | 43.263 |
| 0.251494 | 40.328 |
| 0.339586 | 41.101 |
| 0.416184 | 42.068 |
| 0.469478 | 42.249 |
| 0.520092 | 42.949 |
| 0.557076 | 43.106 |
| 0.589425 | 43.185 |
| 0.622196 | 43.562 |
| 0.646639 | 43.586 |
| 0.671 | 43.605 |
| 0.687571 | 43.642 |
| 0.217287 | 39.941 |
| 0.296 | 40.753 |
| 0.356874 | 41.462 |
| 0.417143 | 41.677 |
| 0.455724 | 42.167 |
| 0.496497 | 42.342 |
| 0.531609 | 42.757 |
| 0.557729 | 43.111 |
| 0.585306 | 43.162 |
| 0.606966 | 43.198 |
| 0.630943 | 43.394 |
| 0.179034 | 39.65 |
| 0.250621 | 40.148 |
| 0.309471 | 40.839 |
| 0.354483 | 41.442 |
| 0.403418 | 41.622 |
| 0.444469 | 42.146 |
| 0.477195 | 42.293 |
| 0.510366 | 42.38 |
| 0.536368 | 42.444 |
| 0.560655 | 42.797 |
| 0.581149 | 43.125 |
| 0.170023 | 38.899 |
| 0.225379 | 39.917 |
| 0.275586 | 40.309 |
| 0.3187 | 40.58 |
| 0.365502 | 41.43 |
| 0.401159 | 41.672 |
| 0.440391 | 42.117 |
| 0.467119 | 42.224 |
| 0.49692 | 42.318 |
| 0.522172 | 42.386 |
| 0.546161 | 42.724 |
| 0.162483 | 38.765 |
| 0.204828 | 39.422 |
| 0.253057 | 40.091 |
| 0.295764 | 40.396 |
| 0.3379 | 41.26 |
| 0.376607 | 41.501 |
| 0.406161 | 41.674 |
| 0.439958 | 41.763 |
| 0.464754 | 42.188 |
| 0.489862 | 42.245 |
| 0.51249 | 42.305 |
| 0.146115 | 38.645 |
| 0.192414 | 39.293 |
| 0.23954 | 39.917 |
| 0.276296 | 40.198 |
| 0.319157 | 40.439 |
| 0.351283 | 40.975 |
| 0.385356 | 41.526 |
| 0.411438 | 41.643 |
| 0.442924 | 41.741 |
| 0.464897 | 42.145 |
| 0.48967 | 42.203 |
| 0.146115 | 38.536 |
| 0.186207 | 39.144 |
| 0.222897 | 39.745 |
| 0.26266 | 40.015 |
| 0.299126 | 40.269 |
| 0.326952 | 40.518 |
| 0.364874 | 41.001 |
| 0.387798 | 41.51 |
| 0.418685 | 41.613 |
| 0.440931 | 41.708 |
| 0.466728 | 42.104 |
| 0.137103 | 38.405 |
| 0.181379 | 39.026 |
| 0.210391 | 39.341 |
| 0.251862 | 39.889 |
| 0.281042 | 40.107 |
| 0.316745 | 40.392 |
| 0.345908 | 40.578 |
| 0.373369 | 41.371 |
| 0.398326 | 41.492 |
| 0.421862 | 41.584 |
| 0.444828 | 41.676 |
| 0.137103 | 38.334 |
| 0.169379 | 38.674 |
| 0.20331 | 39.217 |
| 0.237833 | 39.739 |
| 0.272383 | 39.976 |
| 0.304276 | 40.228 |
| 0.333287 | 40.458 |
| 0.359194 | 40.59 |
| 0.384313 | 41.375 |
| 0.408724 | 41.482 |
| 0.430207 | 41.571 |
| 0.137103 | 38.247 |
| 0.169379 | 38.584 |
| 0.20331 | 39.116 |
| 0.231842 | 39.629 |
| 0.264368 | 39.843 |
| 0.29589 | 40.092 |
| 0.321287 | 40.32 |
| 0.344806 | 40.488 |
| 0.370685 | 40.587 |
| 0.393897 | 40.998 |
| 0.414989 | 41.468 |